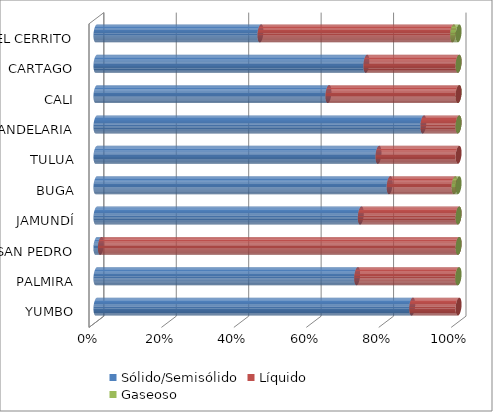
| Category | Sólido/Semisólido | Líquido | Gaseoso |
|---|---|---|---|
| YUMBO | 9930304.44 | 1458050.12 | 0 |
| PALMIRA | 1319975.22 | 511020.3 | 2432.45 |
| SAN PEDRO | 6723.56 | 540774.07 | 0 |
| JAMUNDÍ | 319096.49 | 118033.93 | 8.5 |
| BUGA | 347578.35 | 76916.03 | 4737.83 |
| TULUA | 319779.48 | 90816.79 | 0 |
| CANDELARIA | 306263.37 | 32956.4 | 52 |
| CALI | 130709.35 | 73319.18 | 0 |
| CARTAGO | 131128 | 44773.6 | 0 |
| EL CERRITO | 76647.38 | 90021.1 | 2543.6 |